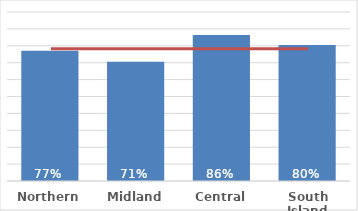
| Category | Total |
|---|---|
| Northern | 0.771 |
| Midland | 0.706 |
| Central | 0.865 |
| South Island | 0.804 |